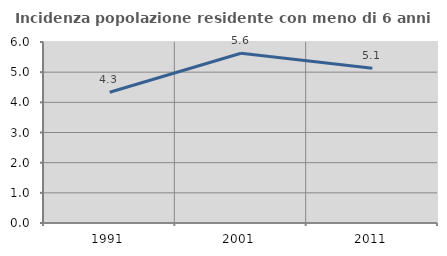
| Category | Incidenza popolazione residente con meno di 6 anni |
|---|---|
| 1991.0 | 4.334 |
| 2001.0 | 5.625 |
| 2011.0 | 5.128 |